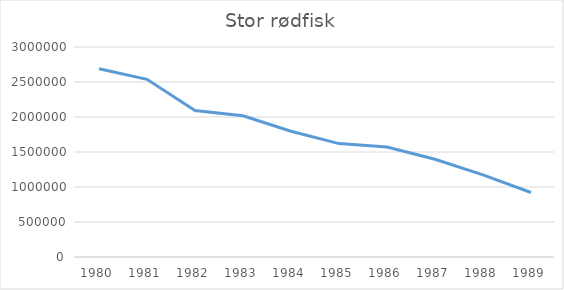
| Category | Series 0 |
|---|---|
| 1980.0 | 2688909 |
| 1981.0 | 2537835 |
| 1982.0 | 2093403 |
| 1983.0 | 2016939 |
| 1984.0 | 1795857 |
| 1985.0 | 1620000 |
| 1986.0 | 1570242 |
| 1987.0 | 1395705 |
| 1988.0 | 1174071 |
| 1989.0 | 921771 |